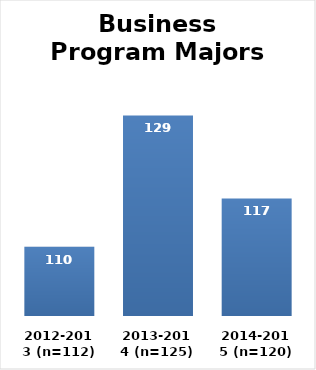
| Category | Series 0 |
|---|---|
| 2012-2013 (n=112) | 110 |
| 2013-2014 (n=125) | 129 |
| 2014-2015 (n=120) | 117 |